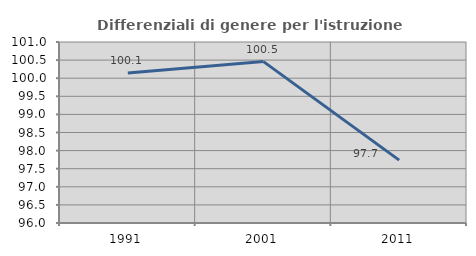
| Category | Differenziali di genere per l'istruzione superiore |
|---|---|
| 1991.0 | 100.145 |
| 2001.0 | 100.459 |
| 2011.0 | 97.736 |